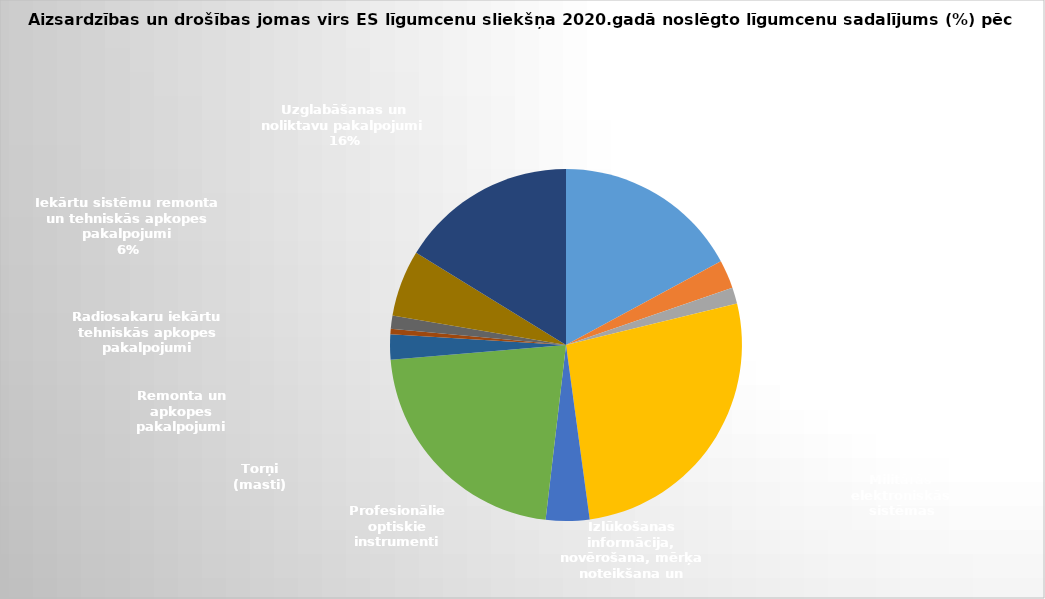
| Category | Series 0 |
|---|---|
| 0 | 0.171 |
| 1 | 0.026 |
| 2 | 0.015 |
| 3 | 0.266 |
| 4 | 0.04 |
| 5 | 0.218 |
| 6 | 0.023 |
| 7 | 0.005 |
| 8 | 0.012 |
| 9 | 0.061 |
| 10 | 0.162 |